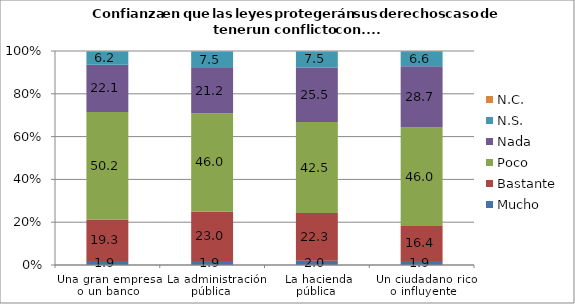
| Category | Mucho  | Bastante | Poco | Nada  | N.S. | N.C.  |
|---|---|---|---|---|---|---|
| Una gran empresa o un banco | 1.9 | 19.3 | 50.2 | 22.1 | 6.2 | 0.2 |
|  La administración pública  | 1.9 | 23 | 46 | 21.2 | 7.5 | 0.4 |
| La hacienda pública  | 2 | 22.3 | 42.5 | 25.5 | 7.5 | 0.2 |
|  Un ciudadano rico o influyente | 1.9 | 16.4 | 46 | 28.7 | 6.6 | 0.5 |